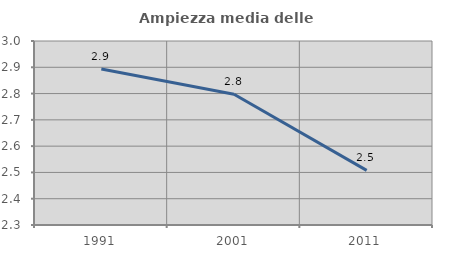
| Category | Ampiezza media delle famiglie |
|---|---|
| 1991.0 | 2.893 |
| 2001.0 | 2.797 |
| 2011.0 | 2.508 |